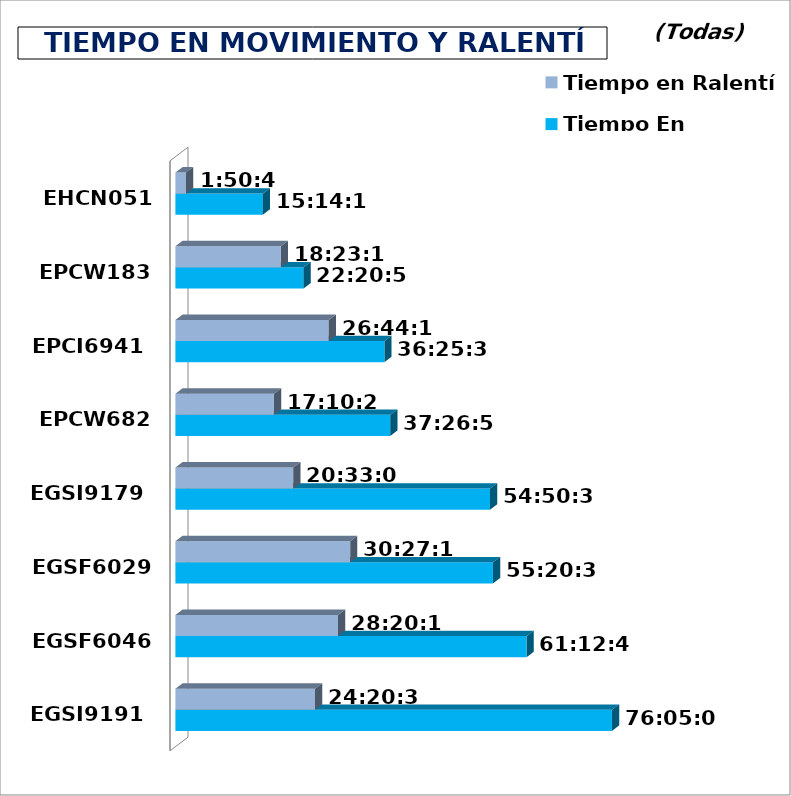
| Category | Tiempo En movimiento | Tiempo en Ralentí |
|---|---|---|
| EGSI9191 | 1900-01-03 04:05:04 | 1900-01-01 00:20:35 |
| EGSF6046 | 1900-01-02 13:12:47 | 1900-01-01 04:20:11 |
| EGSF6029 | 1900-01-02 07:20:35 | 1900-01-01 06:27:14 |
| EGSI9179 | 1900-01-02 06:50:32 | 0.856 |
| EPCW6826 | 1900-01-01 13:26:57 | 0.716 |
| EPCI6941 | 1900-01-01 12:25:33 | 1900-01-01 02:44:13 |
| EPCW1831 | 0.931 | 0.766 |
| EHCN0517 | 0.635 | 0.077 |